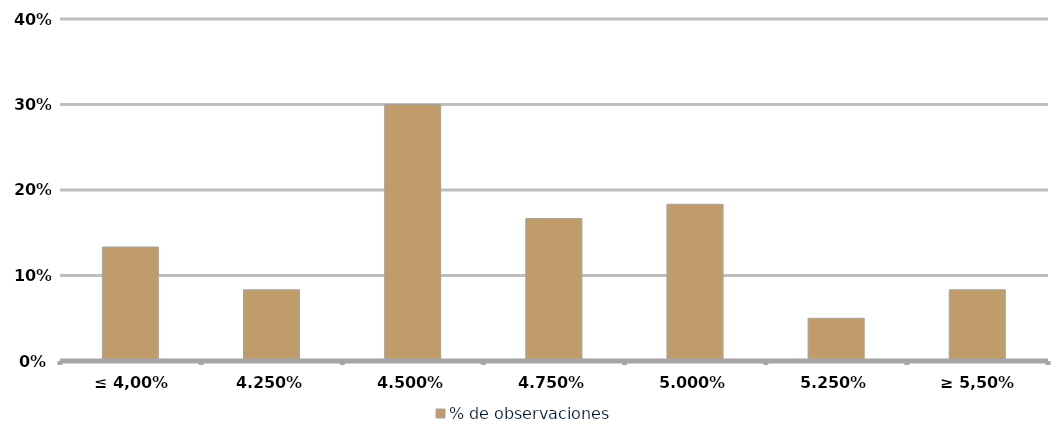
| Category | % de observaciones  |
|---|---|
| ≤ 4,00% | 0.133 |
| 4.25% | 0.083 |
| 4.50% | 0.3 |
| 4.75% | 0.167 |
| 5.00% | 0.183 |
| 5.25% | 0.05 |
| ≥ 5,50% | 0.083 |